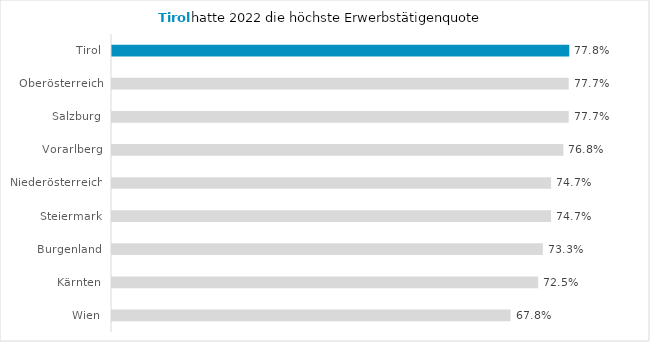
| Category | Erwerbstätigenquote |
|---|---|
| Tirol | 0.778 |
| Oberösterreich | 0.777 |
| Salzburg | 0.777 |
| Vorarlberg | 0.768 |
| Niederösterreich | 0.747 |
| Steiermark | 0.747 |
| Burgenland | 0.733 |
| Kärnten | 0.725 |
| Wien | 0.678 |